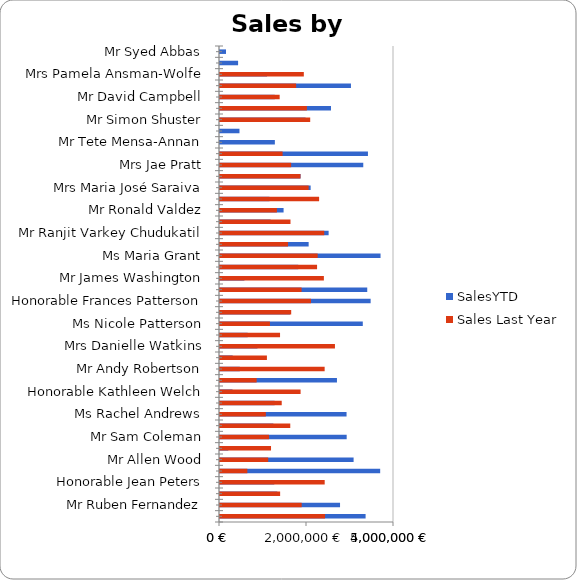
| Category | SalesYTD |
|---|---|
| Mr Syed Abbas | 172524.451 |
| Mrs Amy Alberts | 519905.932 |
| Mrs Pamela Ansman-Wolfe | 1352577.132 |
| Mr Michael Blythe | 3763178.179 |
| Mr David Campbell | 1573012.938 |
| Mr Jillian Carson | 3189418.366 |
| Mr Simon Shuster | 2458535.617 |
| Mr Stephen Jiang | 559697.564 |
| Mr Tete Mensa-Annan | 1576562.197 |
| Mr Bryan Mitchell | 4251368.55 |
| Mrs Jae Pratt | 4116871.228 |
| Mr Tsvi Reiter | 2315185.611 |
| Mrs Maria José Saraiva | 2604540.717 |
| Mrs Lynn Tsoflias | 1421810.924 |
| Mr Ronald Valdez | 1827066.712 |
| Mr Garrett Vargas | 1453719.465 |
| Mr Ranjit Varkey Chudukatil | 3121616.32 |
| Mrs Walter Day | 2547272.8 |
| Ms Maria Grant | 4613381.4 |
| Mr Benjamin Ryan | 2248784.57 |
| Mr James Washington | 701146 |
| Ms Donald Knight | 4231195.75 |
| Honorable Frances Patterson | 4328825.83 |
| Dr Jane Nichols | 2011462.76 |
| Ms Nicole Patterson | 4103353.4 |
| Rev Victor Tucker | 795533.26 |
| Mrs Danielle Watkins | 1076089.52 |
| Mrs Sean Ortiz | 364129.4 |
| Mr Andy Robertson | 569353.97 |
| Mr Louis Jenkins | 3360727.87 |
| Honorable Kathleen Welch | 359035.13 |
| Dr Daniel Butler | 1569015.13 |
| Ms Rachel Andrews | 3636680.27 |
| Mr Daniel Scott | 1533493.48 |
| Mr Sam Coleman | 3640292.41 |
| Dr Robert Wells | 239337.88 |
| Mr Allen Wood | 3839147.15 |
| Honorable Kathy Henderson | 4602668.42 |
| Honorable Jean Peters | 1559831.64 |
| Mr James Evans | 1645881.48 |
| Mr Ruben Fernandez | 3449450.48 |
| Mr Paolo Perez | 4183760 |